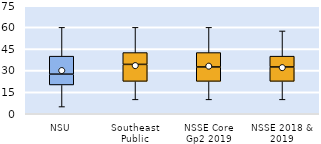
| Category | 25th | 50th | 75th |
|---|---|---|---|
| NSU | 20 | 7.5 | 12.5 |
| Southeast Public | 22.5 | 11.786 | 8.214 |
| NSSE Core Gp2 2019 | 22.5 | 10 | 10 |
| NSSE 2018 & 2019 | 22.5 | 10 | 7.5 |